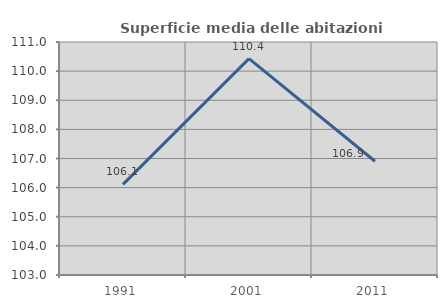
| Category | Superficie media delle abitazioni occupate |
|---|---|
| 1991.0 | 106.11 |
| 2001.0 | 110.428 |
| 2011.0 | 106.906 |